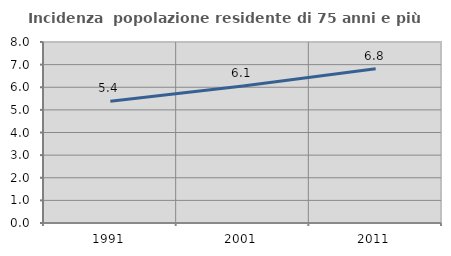
| Category | Incidenza  popolazione residente di 75 anni e più |
|---|---|
| 1991.0 | 5.38 |
| 2001.0 | 6.054 |
| 2011.0 | 6.818 |